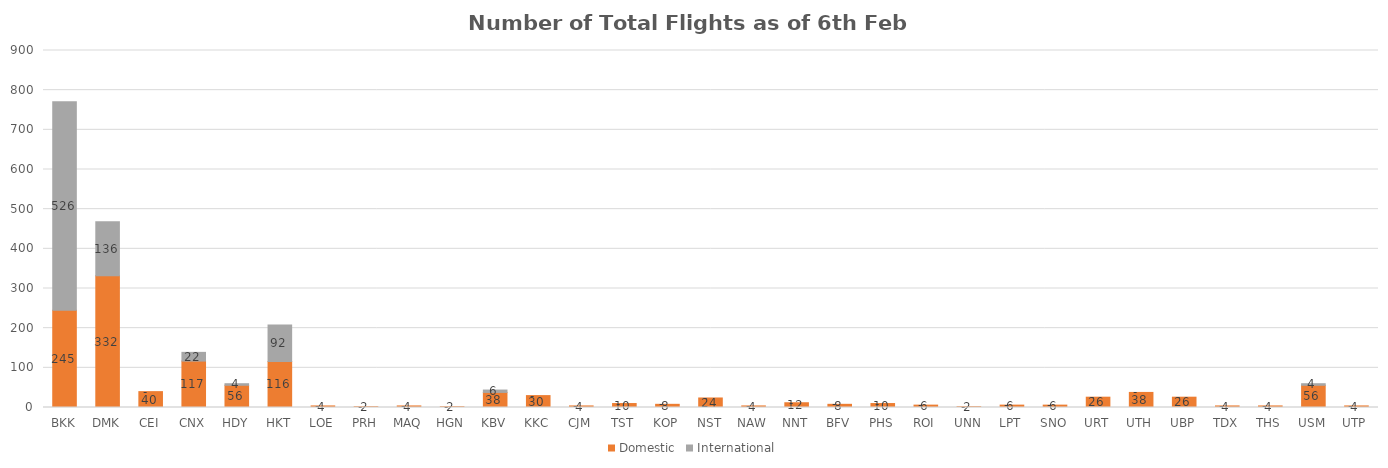
| Category | Domestic | International |
|---|---|---|
| BKK | 245 | 526 |
| DMK | 332 | 136 |
| CEI | 40 | 0 |
| CNX | 117 | 22 |
| HDY | 56 | 4 |
| HKT | 116 | 92 |
| LOE | 4 | 0 |
| PRH | 2 | 0 |
| MAQ | 4 | 0 |
| HGN | 2 | 0 |
| KBV | 38 | 6 |
| KKC | 30 | 0 |
| CJM | 4 | 0 |
| TST | 10 | 0 |
| KOP | 8 | 0 |
| NST | 24 | 0 |
| NAW | 4 | 0 |
| NNT | 12 | 0 |
| BFV | 8 | 0 |
| PHS | 10 | 0 |
| ROI | 6 | 0 |
| UNN | 2 | 0 |
| LPT | 6 | 0 |
| SNO | 6 | 0 |
| URT | 26 | 0 |
| UTH | 38 | 0 |
| UBP | 26 | 0 |
| TDX | 4 | 0 |
| THS | 4 | 0 |
| USM | 56 | 4 |
| UTP | 4 | 0 |